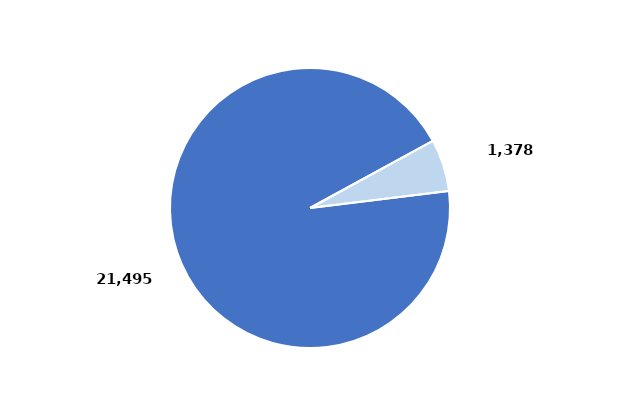
| Category | Series 0 |
|---|---|
| Hombres | 0.94 |
| Mujeres | 0.06 |